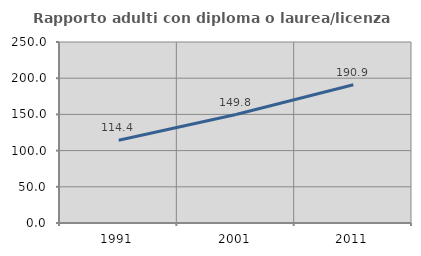
| Category | Rapporto adulti con diploma o laurea/licenza media  |
|---|---|
| 1991.0 | 114.413 |
| 2001.0 | 149.798 |
| 2011.0 | 190.883 |